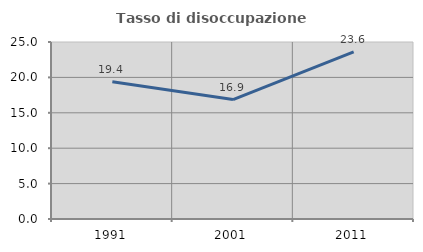
| Category | Tasso di disoccupazione giovanile  |
|---|---|
| 1991.0 | 19.394 |
| 2001.0 | 16.867 |
| 2011.0 | 23.611 |